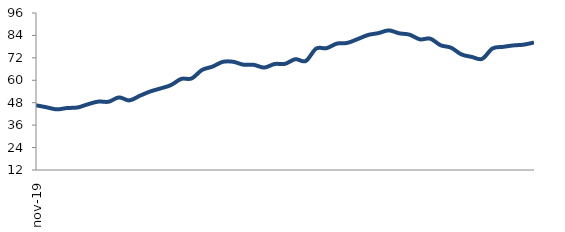
| Category | Series 0 |
|---|---|
| 2019-11-01 | 46.631 |
| 2019-12-01 | 45.576 |
| 2020-01-01 | 44.444 |
| 2020-02-01 | 45.166 |
| 2020-03-01 | 45.444 |
| 2020-04-01 | 47.162 |
| 2020-05-01 | 48.595 |
| 2020-06-01 | 48.53 |
| 2020-07-01 | 50.83 |
| 2020-08-01 | 49.231 |
| 2020-09-01 | 51.699 |
| 2020-10-01 | 53.991 |
| 2020-11-01 | 55.639 |
| 2020-12-01 | 57.413 |
| 2021-01-01 | 60.742 |
| 2021-02-01 | 60.984 |
| 2021-03-01 | 65.524 |
| 2021-04-01 | 67.28 |
| 2021-05-01 | 69.863 |
| 2021-06-01 | 69.912 |
| 2021-07-01 | 68.331 |
| 2021-08-01 | 68.248 |
| 2021-09-01 | 66.807 |
| 2021-10-01 | 68.707 |
| 2021-11-01 | 68.802 |
| 2021-12-01 | 71.282 |
| 2022-01-01 | 70.309 |
| 2022-02-01 | 76.939 |
| 2022-03-01 | 77.168 |
| 2022-04-01 | 79.628 |
| 2022-05-01 | 79.996 |
| 2022-06-01 | 82.029 |
| 2022-07-01 | 84.239 |
| 2022-08-01 | 85.232 |
| 2022-09-01 | 86.701 |
| 2022-10-01 | 85.146 |
| 2022-11-01 | 84.409 |
| 2022-12-01 | 81.907 |
| 2023-01-01 | 82.272 |
| 2023-02-01 | 78.738 |
| 2023-03-01 | 77.447 |
| 2023-04-01 | 73.856 |
| 2023-05-01 | 72.507 |
| 2023-06-01 | 71.462 |
| 2023-07-01 | 77.031 |
| 2023-08-01 | 77.876 |
| 2023-09-01 | 78.647 |
| 2023-10-01 | 79.069 |
| 2023-11-01 | 80.205 |